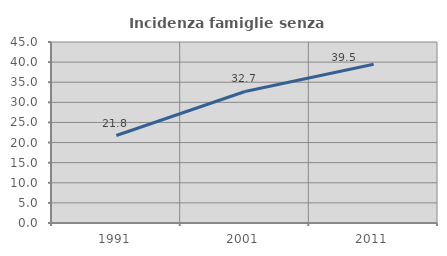
| Category | Incidenza famiglie senza nuclei |
|---|---|
| 1991.0 | 21.752 |
| 2001.0 | 32.701 |
| 2011.0 | 39.474 |